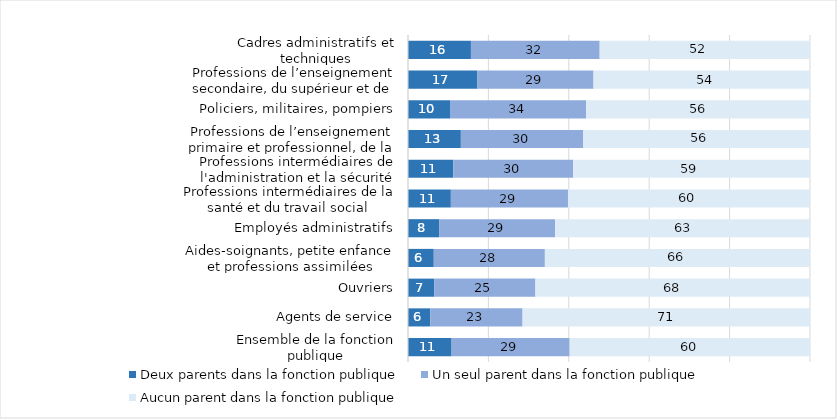
| Category | Deux parents dans la fonction publique | Un seul parent dans la fonction publique | Aucun parent dans la fonction publique |
|---|---|---|---|
| Ensemble de la fonction publique | 10.847 | 29.365 | 59.787 |
| Agents de service | 5.54 | 22.963 | 71.497 |
| Ouvriers | 6.566 | 25.139 | 68.295 |
| Aides-soignants, petite enfance et professions assimilées | 6.414 | 27.634 | 65.953 |
| Employés administratifs | 7.828 | 28.779 | 63.393 |
| Professions intermédiaires de la santé et du travail social | 10.661 | 29.138 | 60.201 |
| Professions intermédiaires de l'administration et la sécurité | 11.283 | 29.805 | 58.912 |
| Professions de l’enseignement primaire et professionnel, de la formation continue et sport | 13.149 | 30.445 | 56.406 |
| Policiers, militaires, pompiers | 10.448 | 33.856 | 55.696 |
| Professions de l’enseignement secondaire, du supérieur et de la recherche  | 17.274 | 28.875 | 53.851 |
| Cadres administratifs et techniques | 15.654 | 32.03 | 52.316 |